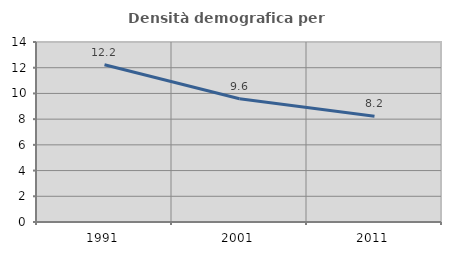
| Category | Densità demografica |
|---|---|
| 1991.0 | 12.23 |
| 2001.0 | 9.583 |
| 2011.0 | 8.221 |